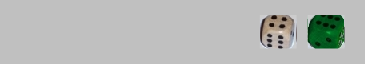
| Category | 1 | 2 | 3 | 4 | 5 | 6 |
|---|---|---|---|---|---|---|
|  | 0 | 0 | 0 | 0 | 0 | 0 |
|  | 0 | 0 | 0 | 0 | 0 | 0 |
|  | 0 | 0 | 0 | 0 | 0 | 0 |
|  | 0 | 0 | 0 | 0 | 0 | 0 |
|  | 0 | 0 | 0 | 0 | 0 | 0 |
| 4 | 0 | 0 | 0 | 1 | 0 | 0 |
| 6 | 0 | 0 | 0 | 0 | 0 | 1 |